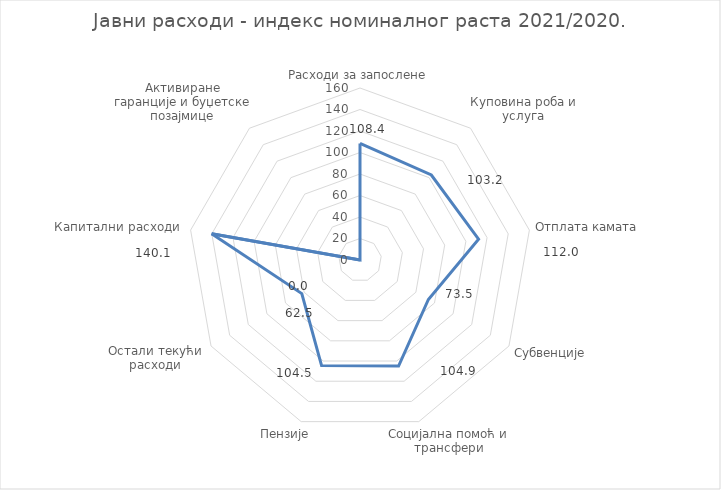
| Category | Series 0 |
|---|---|
| Расходи за запослене | 108.398 |
| Куповина роба и услуга | 103.231 |
| Отплата камата | 111.998 |
| Субвенције | 73.454 |
| Социјална помоћ и трансфери | 104.938 |
| Пензије | 104.514 |
| Остали текући расходи | 62.516 |
| Капитални расходи | 140.13 |
| Активиране гаранције и буџетске позајмице | 0 |